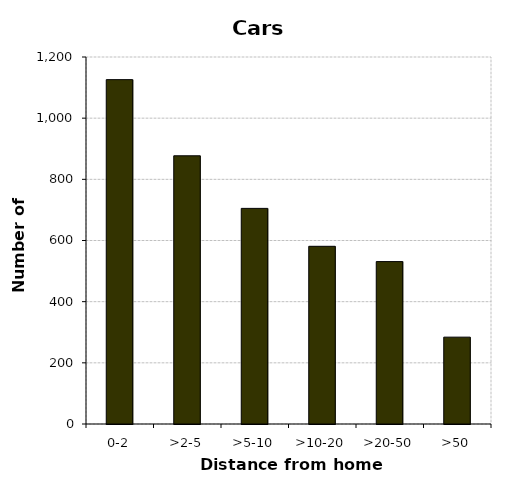
| Category | Cars |
|---|---|
| 0-2 | 1126 |
| >2-5 | 877 |
| >5-10 | 705 |
| >10-20 | 581 |
| >20-50 | 531 |
| >50 | 284 |